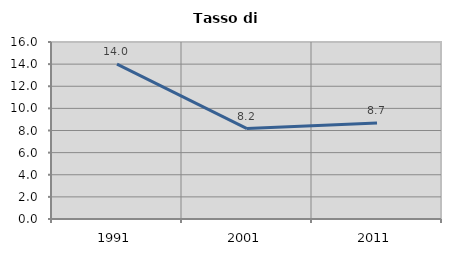
| Category | Tasso di disoccupazione   |
|---|---|
| 1991.0 | 13.997 |
| 2001.0 | 8.172 |
| 2011.0 | 8.671 |